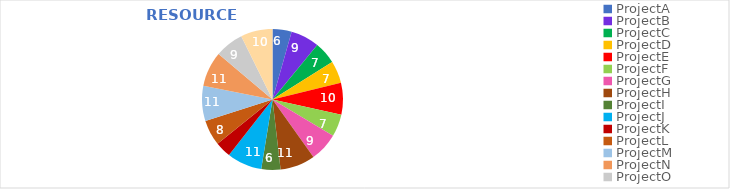
| Category | Series 0 |
|---|---|
| Project A | 10 |
| Project B | 5 |
| Project C | 10 |
| Project D | 5 |
| Project E | 10 |
| Project F | 5 |
| Project G | 10 |
| Project H | 5 |
| Project J | 10 |
| Project K | 5 |
| Project L | 10 |
| Project M | 5 |
| Project N | 10 |
| Project P | 5 |